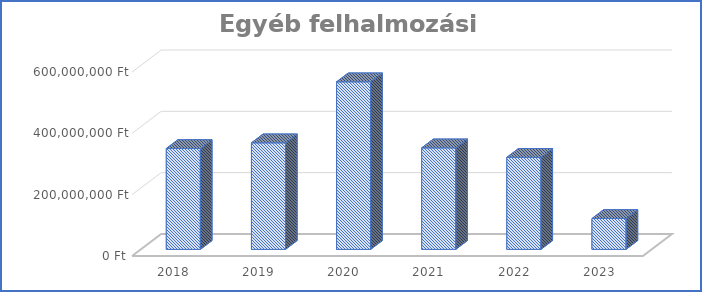
| Category | Egyéb felhalmozási kiadások |
|---|---|
| 2018.0 | 329000000 |
| 2019.0 | 347532723 |
| 2020.0 | 546532801 |
| 2021.0 | 331057850 |
| 2022.0 | 300231670 |
| 2023.0 | 100712499 |